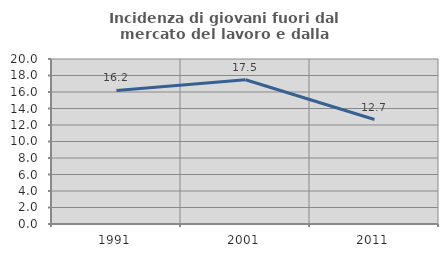
| Category | Incidenza di giovani fuori dal mercato del lavoro e dalla formazione  |
|---|---|
| 1991.0 | 16.196 |
| 2001.0 | 17.486 |
| 2011.0 | 12.667 |